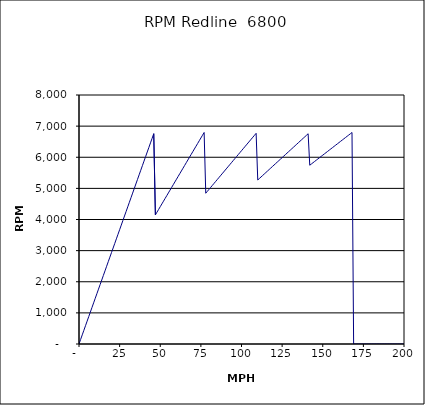
| Category | RPM Redline  6800 |
|---|---|
| 0.0 | 0 |
| 1.0 | 146.894 |
| 2.0 | 293.787 |
| 3.0 | 440.681 |
| 4.0 | 587.574 |
| 5.0 | 734.468 |
| 6.0 | 881.362 |
| 7.0 | 1028.255 |
| 8.0 | 1175.149 |
| 9.0 | 1322.042 |
| 10.0 | 1468.936 |
| 11.0 | 1615.83 |
| 12.0 | 1762.723 |
| 13.0 | 1909.617 |
| 14.0 | 2056.51 |
| 15.0 | 2203.404 |
| 16.0 | 2350.298 |
| 17.0 | 2497.191 |
| 18.0 | 2644.085 |
| 19.0 | 2790.978 |
| 20.0 | 2937.872 |
| 21.0 | 3084.766 |
| 22.0 | 3231.659 |
| 23.0 | 3378.553 |
| 24.0 | 3525.446 |
| 25.0 | 3672.34 |
| 26.0 | 3819.234 |
| 27.0 | 3966.127 |
| 28.0 | 4113.021 |
| 29.0 | 4259.914 |
| 30.0 | 4406.808 |
| 31.0 | 4553.702 |
| 32.0 | 4700.595 |
| 33.0 | 4847.489 |
| 34.0 | 4994.382 |
| 35.0 | 5141.276 |
| 36.0 | 5288.17 |
| 37.0 | 5435.063 |
| 38.0 | 5581.957 |
| 39.0 | 5728.85 |
| 40.0 | 5875.744 |
| 41.0 | 6022.638 |
| 42.0 | 6169.531 |
| 43.0 | 6316.425 |
| 44.0 | 6463.318 |
| 45.0 | 6610.212 |
| 46.0 | 6757.106 |
| 47.0 | 4147.717 |
| 48.0 | 4235.966 |
| 49.0 | 4324.216 |
| 50.0 | 4412.465 |
| 51.0 | 4500.714 |
| 52.0 | 4588.964 |
| 53.0 | 4677.213 |
| 54.0 | 4765.462 |
| 55.0 | 4853.711 |
| 56.0 | 4941.961 |
| 57.0 | 5030.21 |
| 58.0 | 5118.459 |
| 59.0 | 5206.709 |
| 60.0 | 5294.958 |
| 61.0 | 5383.207 |
| 62.0 | 5471.457 |
| 63.0 | 5559.706 |
| 64.0 | 5647.955 |
| 65.0 | 5736.204 |
| 66.0 | 5824.454 |
| 67.0 | 5912.703 |
| 68.0 | 6000.952 |
| 69.0 | 6089.202 |
| 70.0 | 6177.451 |
| 71.0 | 6265.7 |
| 72.0 | 6353.95 |
| 73.0 | 6442.199 |
| 74.0 | 6530.448 |
| 75.0 | 6618.697 |
| 76.0 | 6706.947 |
| 77.0 | 6795.196 |
| 78.0 | 4843.906 |
| 79.0 | 4906.007 |
| 80.0 | 4968.109 |
| 81.0 | 5030.21 |
| 82.0 | 5092.311 |
| 83.0 | 5154.413 |
| 84.0 | 5216.514 |
| 85.0 | 5278.616 |
| 86.0 | 5340.717 |
| 87.0 | 5402.818 |
| 88.0 | 5464.92 |
| 89.0 | 5527.021 |
| 90.0 | 5589.122 |
| 91.0 | 5651.224 |
| 92.0 | 5713.325 |
| 93.0 | 5775.426 |
| 94.0 | 5837.528 |
| 95.0 | 5899.629 |
| 96.0 | 5961.73 |
| 97.0 | 6023.832 |
| 98.0 | 6085.933 |
| 99.0 | 6148.035 |
| 100.0 | 6210.136 |
| 101.0 | 6272.237 |
| 102.0 | 6334.339 |
| 103.0 | 6396.44 |
| 104.0 | 6458.541 |
| 105.0 | 6520.643 |
| 106.0 | 6582.744 |
| 107.0 | 6644.845 |
| 108.0 | 6706.947 |
| 109.0 | 6769.048 |
| 110.0 | 5269.744 |
| 111.0 | 5317.651 |
| 112.0 | 5365.557 |
| 113.0 | 5413.464 |
| 114.0 | 5461.371 |
| 115.0 | 5509.278 |
| 116.0 | 5557.184 |
| 117.0 | 5605.091 |
| 118.0 | 5652.998 |
| 119.0 | 5700.905 |
| 120.0 | 5748.812 |
| 121.0 | 5796.718 |
| 122.0 | 5844.625 |
| 123.0 | 5892.532 |
| 124.0 | 5940.439 |
| 125.0 | 5988.345 |
| 126.0 | 6036.252 |
| 127.0 | 6084.159 |
| 128.0 | 6132.066 |
| 129.0 | 6179.972 |
| 130.0 | 6227.879 |
| 131.0 | 6275.786 |
| 132.0 | 6323.693 |
| 133.0 | 6371.599 |
| 134.0 | 6419.506 |
| 135.0 | 6467.413 |
| 136.0 | 6515.32 |
| 137.0 | 6563.227 |
| 138.0 | 6611.133 |
| 139.0 | 6659.04 |
| 140.0 | 6706.947 |
| 141.0 | 6754.854 |
| 142.0 | 5743.559 |
| 143.0 | 5784.006 |
| 144.0 | 5824.454 |
| 145.0 | 5864.901 |
| 146.0 | 5905.349 |
| 147.0 | 5945.797 |
| 148.0 | 5986.244 |
| 149.0 | 6026.692 |
| 150.0 | 6067.139 |
| 151.0 | 6107.587 |
| 152.0 | 6148.035 |
| 153.0 | 6188.482 |
| 154.0 | 6228.93 |
| 155.0 | 6269.377 |
| 156.0 | 6309.825 |
| 157.0 | 6350.273 |
| 158.0 | 6390.72 |
| 159.0 | 6431.168 |
| 160.0 | 6471.615 |
| 161.0 | 6512.063 |
| 162.0 | 6552.511 |
| 163.0 | 6592.958 |
| 164.0 | 6633.406 |
| 165.0 | 6673.853 |
| 166.0 | 6714.301 |
| 167.0 | 6754.748 |
| 168.0 | 6795.196 |
| 169.0 | 0 |
| 170.0 | 0 |
| 171.0 | 0 |
| 172.0 | 0 |
| 173.0 | 0 |
| 174.0 | 0 |
| 175.0 | 0 |
| 176.0 | 0 |
| 177.0 | 0 |
| 178.0 | 0 |
| 179.0 | 0 |
| 180.0 | 0 |
| 181.0 | 0 |
| 182.0 | 0 |
| 183.0 | 0 |
| 184.0 | 0 |
| 185.0 | 0 |
| 186.0 | 0 |
| 187.0 | 0 |
| 188.0 | 0 |
| 189.0 | 0 |
| 190.0 | 0 |
| 191.0 | 0 |
| 192.0 | 0 |
| 193.0 | 0 |
| 194.0 | 0 |
| 195.0 | 0 |
| 196.0 | 0 |
| 197.0 | 0 |
| 198.0 | 0 |
| 199.0 | 0 |
| 200.0 | 0 |